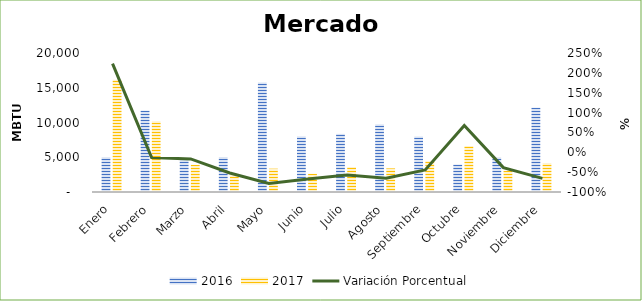
| Category | 2016 | 2017 |
|---|---|---|
| Enero | 5000 | 16158.971 |
| Febrero | 11722.222 | 10175.556 |
| Marzo | 4700 | 3915.077 |
| Abril | 5022.95 | 2400 |
| Mayo | 15747.059 | 3358.333 |
| Junio | 8000 | 2623.029 |
| Julio | 8364 | 3585.5 |
| Agosto | 9728.571 | 3398.37 |
| Septiembre | 7982.5 | 4427.857 |
| Octubre | 3954.5 | 6618.333 |
| Noviembre | 4983.091 | 3056.876 |
| Diciembre | 12136.123 | 4156.132 |